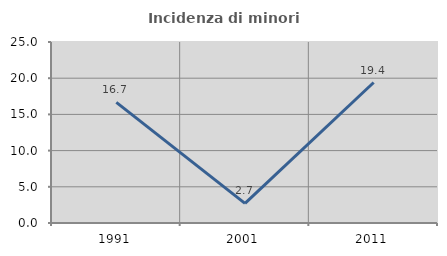
| Category | Incidenza di minori stranieri |
|---|---|
| 1991.0 | 16.667 |
| 2001.0 | 2.703 |
| 2011.0 | 19.403 |